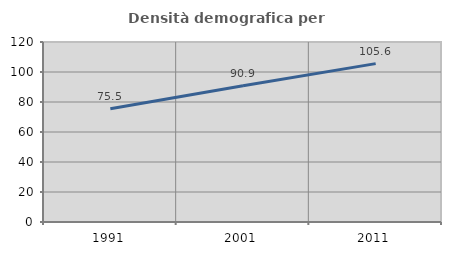
| Category | Densità demografica |
|---|---|
| 1991.0 | 75.472 |
| 2001.0 | 90.851 |
| 2011.0 | 105.582 |